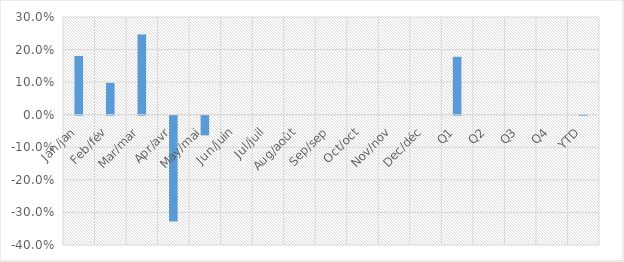
| Category | Total YoY % Change |
|---|---|
| Jan/jan | 0.18 |
| Feb/fév | 0.098 |
| Mar/mar | 0.247 |
| Apr/avr | -0.325 |
| May/mai | -0.06 |
| Jun/juin | 0 |
| Jul/juil | 0 |
| Aug/août | 0 |
| Sep/sep | 0 |
| Oct/oct | 0 |
| Nov/nov | 0 |
| Dec/déc | 0 |
| Q1 | 0.178 |
| Q2 | 0 |
| Q3 | 0 |
| Q4 | 0 |
| YTD | 0 |